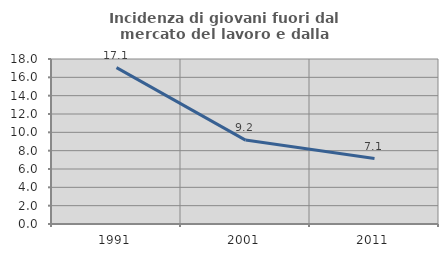
| Category | Incidenza di giovani fuori dal mercato del lavoro e dalla formazione  |
|---|---|
| 1991.0 | 17.062 |
| 2001.0 | 9.155 |
| 2011.0 | 7.143 |